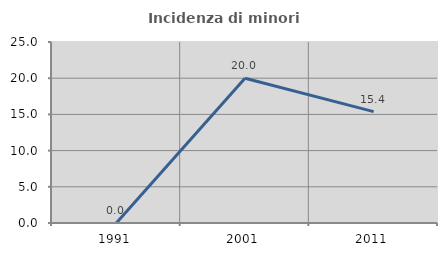
| Category | Incidenza di minori stranieri |
|---|---|
| 1991.0 | 0 |
| 2001.0 | 20 |
| 2011.0 | 15.385 |